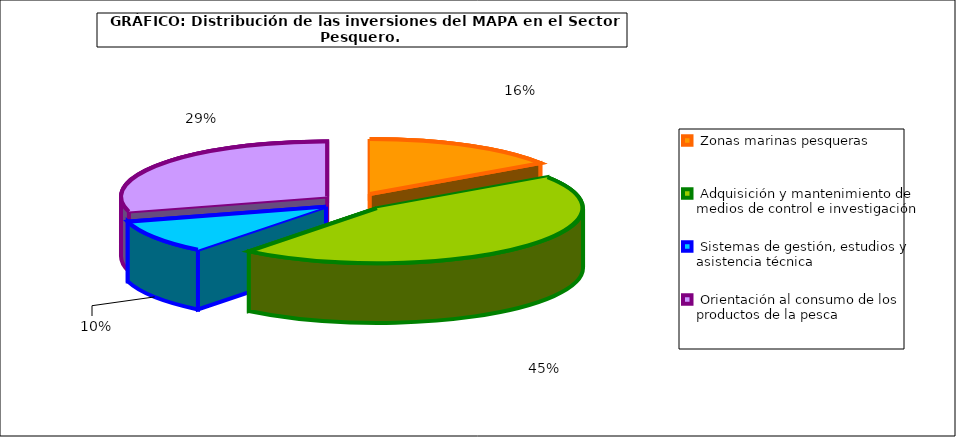
| Category | Series 0 |
|---|---|
|  Zonas marinas pesqueras | 4234.017 |
|  Adquisición y mantenimiento de medios de control e investigación  | 12330.343 |
|  Sistemas de gestión, estudios y asistencia técnica | 2707.25 |
|  Orientación al consumo de los productos de la pesca | 8029.877 |